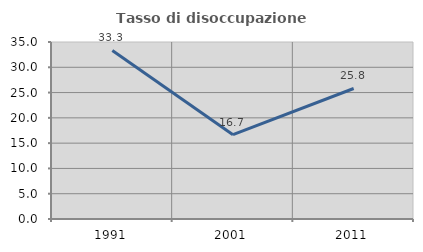
| Category | Tasso di disoccupazione giovanile  |
|---|---|
| 1991.0 | 33.333 |
| 2001.0 | 16.667 |
| 2011.0 | 25.806 |